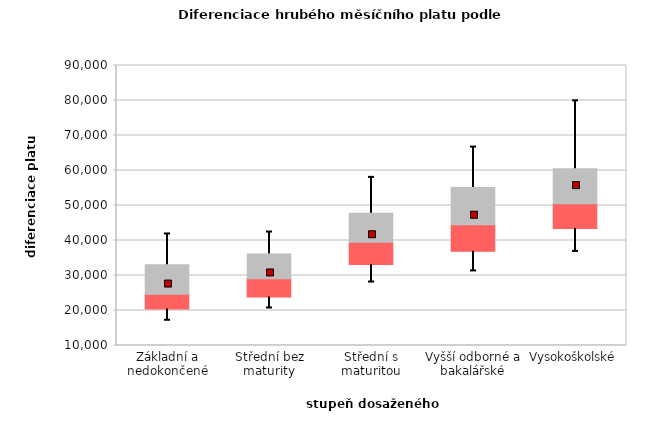
| Category | 0.25 | 0.5 | 0.75 |
|---|---|---|---|
| Základní a nedokončené | 20437.737 | 4232.516 | 8417.557 |
| Střední bez maturity | 23823.917 | 5276.614 | 7011.768 |
| Střední s maturitou | 33172.238 | 6310.209 | 8283.013 |
| Vyšší odborné a bakalářské | 36914.603 | 7591.077 | 10628.836 |
| Vysokoškolské | 43456.26 | 7022.437 | 10056.67 |